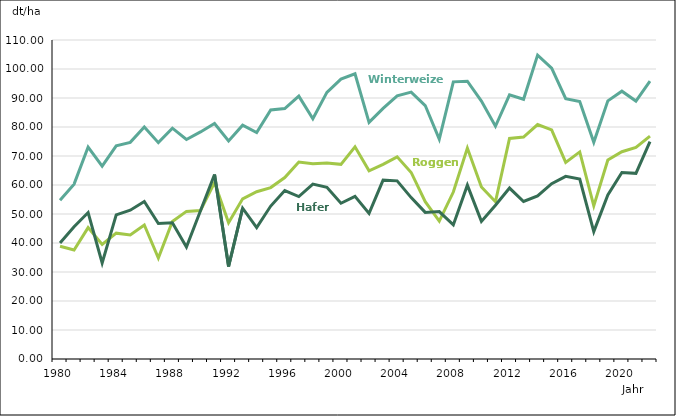
| Category | Winterweizen | Roggen  | Hafer |
|---|---|---|---|
| 1980.0 | 54.76 | 38.9 | 40 |
| 1981.0 | 60.3 | 37.6 | 45.6 |
| 1982.0 | 73.1 | 45.3 | 50.5 |
| 1983.0 | 66.5 | 39.5 | 33.1 |
| 1984.0 | 73.5 | 43.4 | 49.7 |
| 1985.0 | 74.7 | 42.8 | 51.3 |
| 1986.0 | 80 | 46.2 | 54.3 |
| 1987.0 | 74.6 | 34.8 | 46.7 |
| 1988.0 | 79.6 | 47.4 | 47 |
| 1989.0 | 75.7 | 50.9 | 38.6 |
| 1990.0 | 78.3 | 51.2 | 51.1 |
| 1991.0 | 81.2 | 60.8 | 63.6 |
| 1992.0 | 75.2 | 47 | 31.9 |
| 1993.0 | 80.63 | 55.22 | 52.01 |
| 1994.0 | 78.11 | 57.69 | 45.32 |
| 1995.0 | 85.86 | 59.11 | 52.74 |
| 1996.0 | 86.37 | 62.56 | 58.1 |
| 1997.0 | 90.66 | 67.91 | 56.01 |
| 1998.0 | 82.83 | 67.31 | 60.33 |
| 1999.0 | 91.95 | 67.59 | 59.23 |
| 2000.0 | 96.51 | 67.12 | 53.7 |
| 2001.0 | 98.35 | 73.15 | 56.08 |
| 2002.0 | 81.58 | 64.87 | 50.22 |
| 2003.0 | 86.44 | 67.11 | 61.67 |
| 2004.0 | 90.74 | 69.7 | 61.43 |
| 2005.0 | 92.01 | 64.32 | 55.65 |
| 2006.0 | 87.4 | 54.24 | 50.55 |
| 2007.0 | 75.82 | 47.53 | 50.82 |
| 2008.0 | 95.56 | 57.57 | 46.23 |
| 2009.0 | 95.8 | 72.73 | 59.94 |
| 2010.0 | 88.93 | 59.33 | 47.46 |
| 2011.0 | 80.26 | 54.22 | 53.03 |
| 2012.0 | 91.08 | 76.06 | 58.94 |
| 2013.0 | 89.56 | 76.55 | 54.31 |
| 2014.0 | 104.79 | 80.83 | 56.23 |
| 2015.0 | 100.29 | 78.98 | 60.47 |
| 2016.0 | 89.75 | 67.8 | 62.97 |
| 2017.0 | 88.78 | 71.41 | 62.05 |
| 2018.0 | 74.72 | 52.81 | 43.94 |
| 2019.0 | 89.01 | 68.61 | 56.56 |
| 2020.0 | 92.35 | 71.48 | 64.3 |
| 2021.0 | 88.94 | 72.96 | 64.01 |
| 2022.0 | 95.81 | 76.86 | 74.93 |